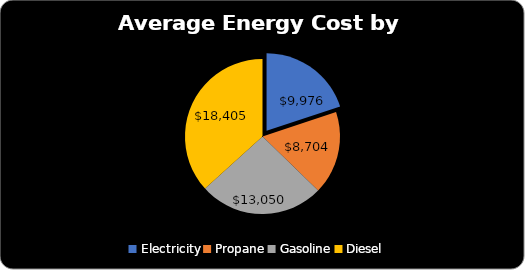
| Category | Series 0 |
|---|---|
| Electricity | 9975.95 |
| Propane | 8703.5 |
| Gasoline | 13050.02 |
| Diesel | 18405.21 |